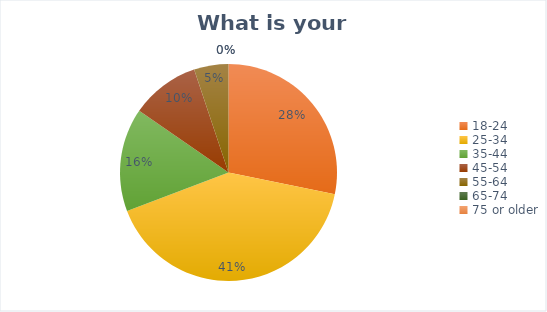
| Category | Series 0 |
|---|---|
| 18-24 | 11 |
| 25-34 | 16 |
| 35-44 | 6 |
| 45-54 | 4 |
| 55-64 | 2 |
| 65-74 | 0 |
| 75 or older | 0 |